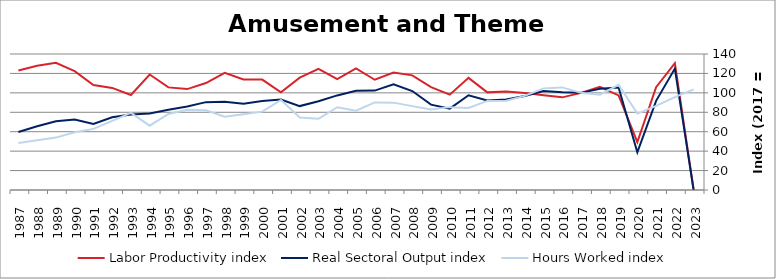
| Category | Labor Productivity index | Real Sectoral Output index | Hours Worked index |
|---|---|---|---|
| 2023.0 | 0 | 0 | 103.638 |
| 2022.0 | 130.58 | 124.948 | 95.687 |
| 2021.0 | 105.861 | 91.756 | 86.676 |
| 2020.0 | 49.33 | 38.82 | 78.694 |
| 2019.0 | 97.385 | 105.496 | 108.328 |
| 2018.0 | 106.249 | 104.211 | 98.082 |
| 2017.0 | 100 | 100 | 100 |
| 2016.0 | 95.37 | 100.734 | 105.624 |
| 2015.0 | 97.45 | 101.946 | 104.614 |
| 2014.0 | 99.822 | 96.724 | 96.896 |
| 2013.0 | 101.519 | 93.251 | 91.855 |
| 2012.0 | 100.502 | 92.199 | 91.738 |
| 2011.0 | 115.42 | 97.559 | 84.525 |
| 2010.0 | 98.13 | 83.71 | 85.306 |
| 2009.0 | 105.883 | 87.864 | 82.982 |
| 2008.0 | 118.013 | 101.882 | 86.331 |
| 2007.0 | 120.896 | 108.72 | 89.929 |
| 2006.0 | 113.479 | 102.309 | 90.157 |
| 2005.0 | 125.082 | 102.069 | 81.602 |
| 2004.0 | 114.256 | 97.377 | 85.227 |
| 2003.0 | 124.701 | 91.371 | 73.272 |
| 2002.0 | 115.626 | 86.387 | 74.712 |
| 2001.0 | 100.565 | 93.153 | 92.629 |
| 2000.0 | 113.634 | 91.685 | 80.684 |
| 1999.0 | 113.785 | 88.808 | 78.049 |
| 1998.0 | 120.666 | 90.967 | 75.387 |
| 1997.0 | 110.102 | 90.447 | 82.149 |
| 1996.0 | 103.874 | 85.881 | 82.678 |
| 1995.0 | 105.626 | 82.671 | 78.267 |
| 1994.0 | 118.89 | 78.695 | 66.191 |
| 1993.0 | 97.807 | 77.656 | 79.397 |
| 1992.0 | 105.106 | 74.846 | 71.21 |
| 1991.0 | 108.16 | 68.064 | 62.93 |
| 1990.0 | 122.377 | 72.64 | 59.357 |
| 1989.0 | 131.008 | 70.662 | 53.937 |
| 1988.0 | 127.99 | 65.679 | 51.316 |
| 1987.0 | 122.982 | 59.643 | 48.498 |